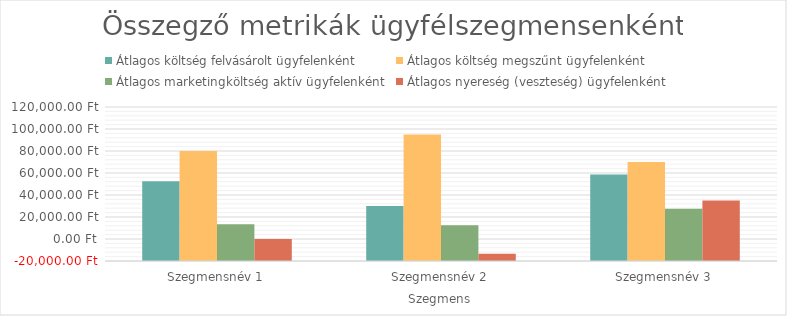
| Category | Átlagos költség felvásárolt ügyfelenként | Átlagos költség megszűnt ügyfelenként | Átlagos marketingköltség aktív ügyfelenként | Átlagos nyereség (veszteség) ügyfelenként |
|---|---|---|---|---|
| Szegmensnév 1 | 52500 | 80000 | 13333.333 | 0 |
| Szegmensnév 2 | 30000 | 95000 | 12500 | -13500 |
| Szegmensnév 3 | 58750 | 70000 | 27500 | 35000 |